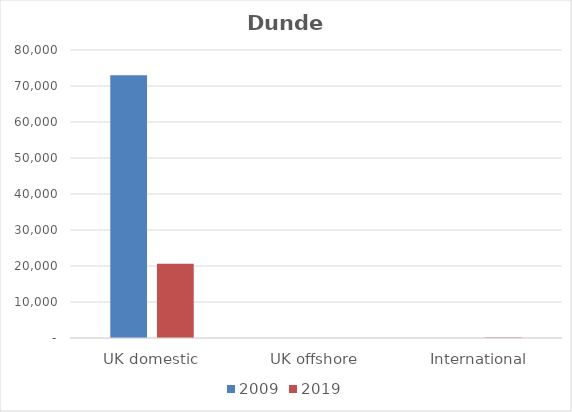
| Category | 2009 | 2019 |
|---|---|---|
| UK domestic | 72994 | 20636 |
| UK offshore | 0 | 0 |
| International | 0 | 132 |